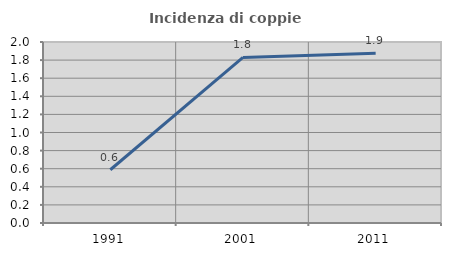
| Category | Incidenza di coppie miste |
|---|---|
| 1991.0 | 0.588 |
| 2001.0 | 1.83 |
| 2011.0 | 1.877 |